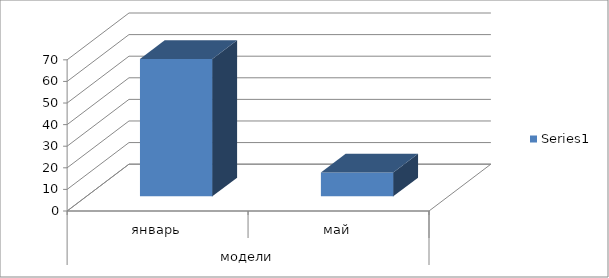
| Category | Series 0 |
|---|---|
| 0 | 63.611 |
| 1 | 11.1 |